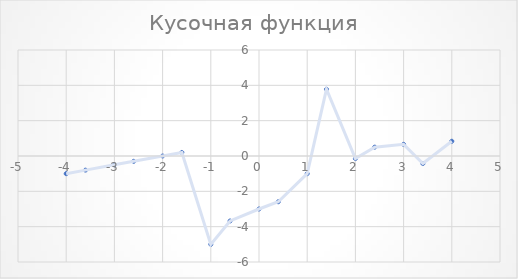
| Category | Y |
|---|---|
| -4.0 | -1 |
| -3.6 | -0.8 |
| -3.0 | -0.5 |
| -2.6 | -0.3 |
| -2.0 | 0 |
| -1.6 | 0.2 |
| -1.0 | -5 |
| -0.6 | -3.678 |
| 0.0 | -3 |
| 0.4 | -2.59 |
| 1.0 | -1 |
| 1.4 | 3.778 |
| 2.0 | -0.146 |
| 2.4 | 0.501 |
| 3.0 | 0.66 |
| 3.4 | -0.428 |
| 4.0 | 0.834 |